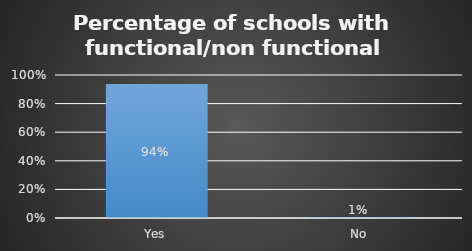
| Category | Series 0 |
|---|---|
| Yes | 0.936 |
| No | 0.007 |